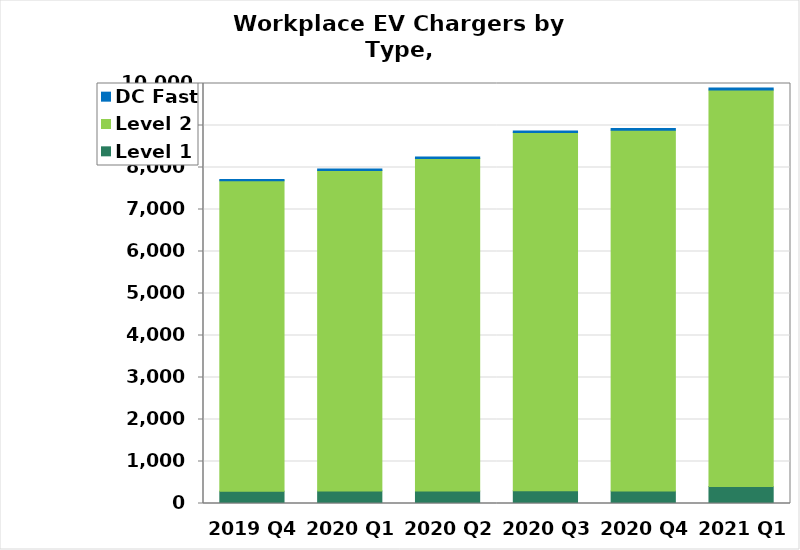
| Category | Level 1 | Level 2 | DC Fast |
|---|---|---|---|
| 2019 Q4 | 292 | 7390 | 34 |
| 2020 Q1 | 295 | 7636 | 36 |
| 2020 Q2 | 297 | 7915 | 37 |
| 2020 Q3 | 301 | 8532 | 39 |
| 2020 Q4 | 299 | 8589 | 42 |
| 2021 Q1 | 405 | 9439 | 50 |